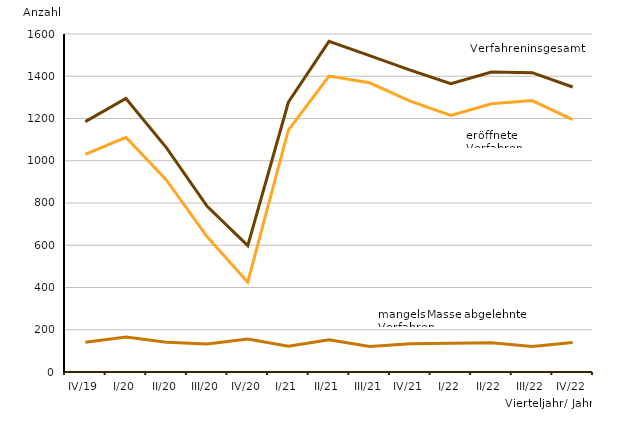
| Category | Series 0 | Series 1 | Series 2 |
|---|---|---|---|
| IV/19 | 1185 | 1030 | 141 |
| I/20 | 1295 | 1111 | 166 |
| II/20 | 1061 | 908 | 141 |
| III/20 | 784 | 640 | 133 |
| IV/20 | 598 | 425 | 156 |
| I/21 | 1277 | 1145 | 122 |
| II/21 | 1565 | 1401 | 153 |
| III/21 | 1498 | 1369 | 121 |
| IV/21 | 1429 | 1282 | 134 |
| I/22 | 1365 | 1215 | 136 |
| II/22 | 1420 | 1270 | 138 |
| III/22 | 1417 | 1285 | 121 |
| IV/22 | 1349 | 1195 | 140 |